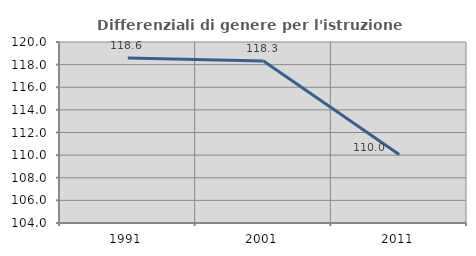
| Category | Differenziali di genere per l'istruzione superiore |
|---|---|
| 1991.0 | 118.591 |
| 2001.0 | 118.327 |
| 2011.0 | 110.046 |